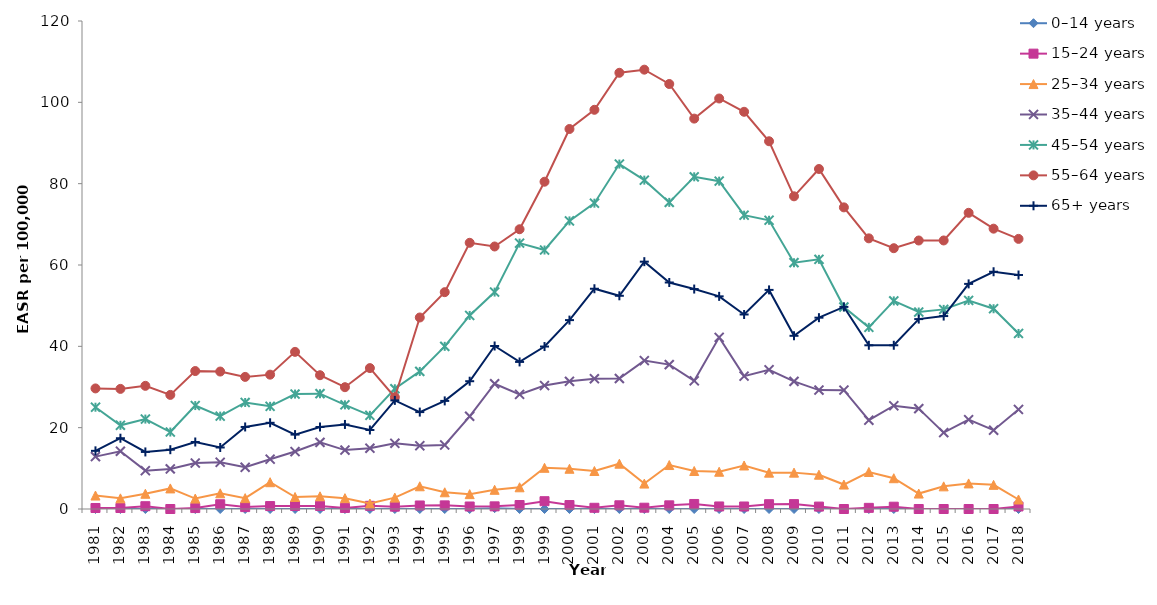
| Category | 0–14 years | 15–24 years | 25–34 years | 35–44 years | 45–54 years | 55–64 years | 65+ years |
|---|---|---|---|---|---|---|---|
| 1981.0 | 0 | 0.248 | 3.305 | 12.883 | 25.029 | 29.651 | 14.3 |
| 1982.0 | 0 | 0.243 | 2.617 | 14.204 | 20.584 | 29.535 | 17.406 |
| 1983.0 | 0 | 0.685 | 3.746 | 9.434 | 22.111 | 30.286 | 14.031 |
| 1984.0 | 0 | 0 | 5.062 | 9.854 | 18.929 | 28.06 | 14.583 |
| 1985.0 | 0 | 0.232 | 2.564 | 11.296 | 25.434 | 33.924 | 16.476 |
| 1986.0 | 0 | 1.168 | 3.863 | 11.498 | 22.838 | 33.801 | 15.129 |
| 1987.0 | 0 | 0.466 | 2.672 | 10.253 | 26.195 | 32.486 | 20.176 |
| 1988.0 | 0 | 0.72 | 6.587 | 12.248 | 25.249 | 33.035 | 21.199 |
| 1989.0 | 0 | 0.744 | 2.954 | 14.125 | 28.262 | 38.638 | 18.295 |
| 1990.0 | 0 | 0.754 | 3.123 | 16.385 | 28.362 | 32.899 | 20.168 |
| 1991.0 | 0 | 0.254 | 2.665 | 14.483 | 25.61 | 29.954 | 20.792 |
| 1992.0 | 0 | 0.785 | 1.346 | 14.946 | 23.03 | 34.651 | 19.428 |
| 1993.0 | 0 | 0.575 | 2.798 | 16.162 | 29.569 | 27.484 | 26.709 |
| 1994.0 | 0 | 0.868 | 5.59 | 15.546 | 33.826 | 47.092 | 23.83 |
| 1995.0 | 0 | 0.892 | 4.111 | 15.736 | 39.997 | 53.321 | 26.582 |
| 1996.0 | 0 | 0.616 | 3.654 | 22.792 | 47.596 | 65.459 | 31.423 |
| 1997.0 | 0.211 | 0.652 | 4.719 | 30.796 | 53.34 | 64.552 | 40.084 |
| 1998.0 | 0 | 0.977 | 5.34 | 28.18 | 65.38 | 68.794 | 36.166 |
| 1999.0 | 0 | 1.919 | 10.128 | 30.357 | 63.687 | 80.478 | 39.95 |
| 2000.0 | 0 | 0.975 | 9.897 | 31.392 | 70.841 | 93.443 | 46.449 |
| 2001.0 | 0 | 0.297 | 9.346 | 32.048 | 75.204 | 98.164 | 54.16 |
| 2002.0 | 0 | 0.914 | 11.139 | 32.097 | 84.821 | 107.267 | 52.431 |
| 2003.0 | 0 | 0.318 | 6.249 | 36.487 | 80.867 | 108.033 | 60.82 |
| 2004.0 | 0 | 0.902 | 10.811 | 35.502 | 75.4 | 104.508 | 55.7 |
| 2005.0 | 0 | 1.234 | 9.345 | 31.526 | 81.686 | 95.998 | 54.086 |
| 2006.0 | 0 | 0.623 | 9.16 | 42.207 | 80.619 | 100.945 | 52.29 |
| 2007.0 | 0 | 0.617 | 10.698 | 32.672 | 72.253 | 97.675 | 47.832 |
| 2008.0 | 0 | 1.181 | 8.935 | 34.239 | 70.998 | 90.429 | 53.877 |
| 2009.0 | 0 | 1.204 | 8.945 | 31.377 | 60.578 | 76.892 | 42.589 |
| 2010.0 | 0 | 0.593 | 8.428 | 29.236 | 61.387 | 83.608 | 47.045 |
| 2011.0 | 0 | 0 | 6.013 | 29.229 | 49.674 | 74.173 | 49.699 |
| 2012.0 | 0 | 0.282 | 9.102 | 21.837 | 44.673 | 66.557 | 40.259 |
| 2013.0 | 0 | 0.566 | 7.571 | 25.393 | 51.177 | 64.131 | 40.264 |
| 2014.0 | 0 | 0 | 3.796 | 24.676 | 48.438 | 66.026 | 46.699 |
| 2015.0 | 0 | 0 | 5.569 | 18.787 | 49.089 | 66.035 | 47.447 |
| 2016.0 | 0 | 0 | 6.288 | 21.958 | 51.286 | 72.829 | 55.354 |
| 2017.0 | 0 | 0 | 5.937 | 19.383 | 49.245 | 68.934 | 58.34 |
| 2018.0 | 0 | 0.623 | 2.338 | 24.476 | 43.168 | 66.423 | 57.539 |